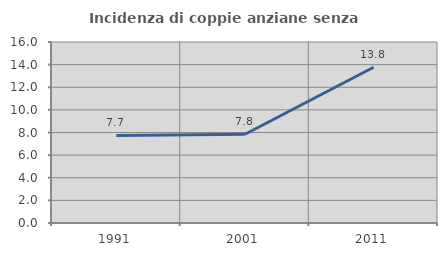
| Category | Incidenza di coppie anziane senza figli  |
|---|---|
| 1991.0 | 7.742 |
| 2001.0 | 7.843 |
| 2011.0 | 13.768 |